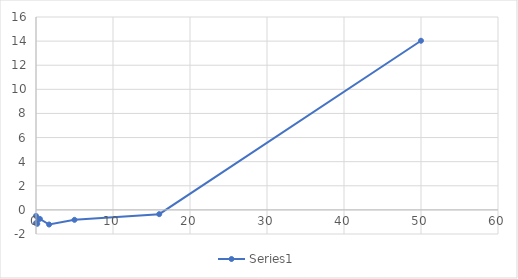
| Category | Series 0 |
|---|---|
| 50.0 | 14.03 |
| 16.0 | -0.354 |
| 5.0 | -0.825 |
| 1.7 | -1.214 |
| 0.5 | -0.743 |
| 0.16 | -1.156 |
| 0.0 | -0.498 |
| 0.0 | -1.096 |